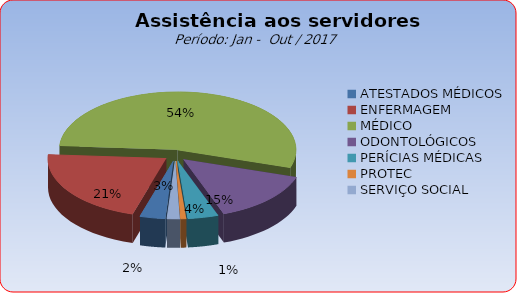
| Category | Series 0 |
|---|---|
| ATESTADOS MÉDICOS | 3.466 |
| ENFERMAGEM | 21.481 |
| MÉDICO | 53.906 |
| ODONTOLÓGICOS | 14.514 |
| PERÍCIAS MÉDICAS | 4.17 |
| PROTEC | 0.739 |
| SERVIÇO SOCIAL | 1.724 |